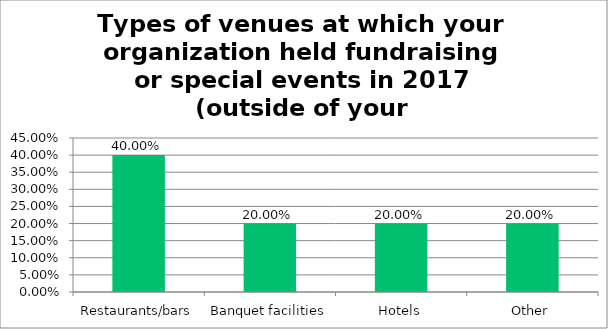
| Category | Responses |
|---|---|
| Restaurants/bars | 0.4 |
| Banquet facilities | 0.2 |
| Hotels | 0.2 |
| Other | 0.2 |